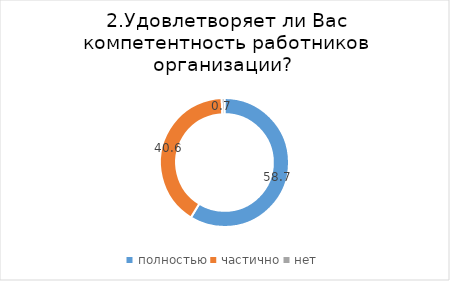
| Category | Series 0 |
|---|---|
| полностью | 58.741 |
| частично | 40.559 |
| нет | 0.699 |